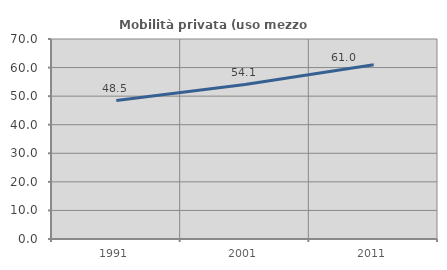
| Category | Mobilità privata (uso mezzo privato) |
|---|---|
| 1991.0 | 48.459 |
| 2001.0 | 54.068 |
| 2011.0 | 60.967 |